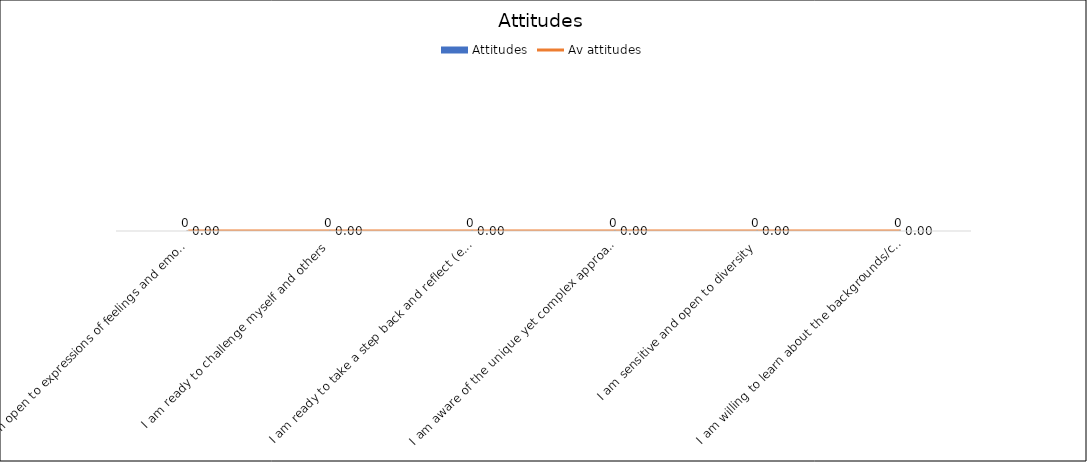
| Category | Attitudes |
|---|---|
| I am open to expressions of feelings and emotions (my own and others’) | 0 |
| I am ready to challenge myself and others | 0 |
| I am ready to take a step back and reflect (e.g. on my own perceptions, understanding, feelings) | 0 |
| I am aware of the unique yet complex approach to my identity and how to deal with it when working in a group | 0 |
| I am sensitive and open to diversity | 0 |
| I am willing to learn about the backgrounds/contexts/realities of the young people | 0 |